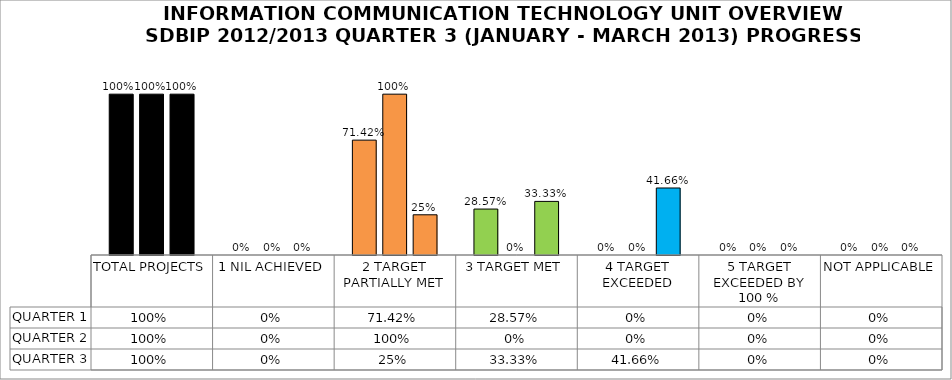
| Category | QUARTER 1 | QUARTER 2 | QUARTER 3 |
|---|---|---|---|
| TOTAL PROJECTS | 1 | 1 | 1 |
| 1 NIL ACHIEVED | 0 | 0 | 0 |
| 2 TARGET PARTIALLY MET | 0.714 | 1 | 0.25 |
| 3 TARGET MET | 0.286 | 0 | 0.333 |
| 4 TARGET EXCEEDED | 0 | 0 | 0.417 |
| 5 TARGET EXCEEDED BY 100 % | 0 | 0 | 0 |
| NOT APPLICABLE | 0 | 0 | 0 |